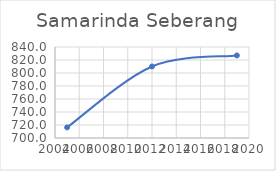
| Category | Series 0 |
|---|---|
| 2005.0 | 716.327 |
| 2012.0 | 810.038 |
| 2019.0 | 827.022 |